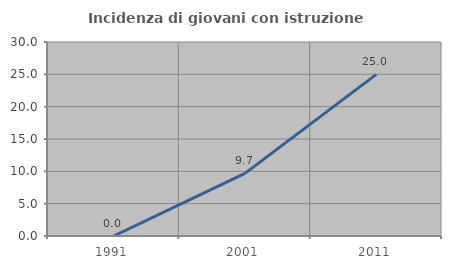
| Category | Incidenza di giovani con istruzione universitaria |
|---|---|
| 1991.0 | 0 |
| 2001.0 | 9.677 |
| 2011.0 | 25 |